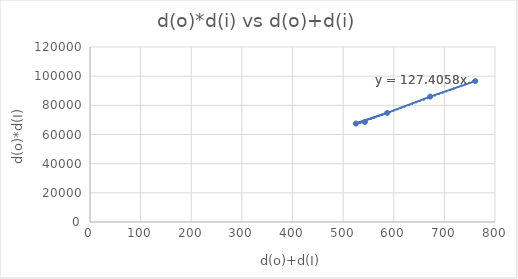
| Category | Series 0 |
|---|---|
| 543.0 | 68600 |
| 525.0 | 67500 |
| 587.0 | 74800 |
| 672.0 | 86000 |
| 761.0 | 96600 |